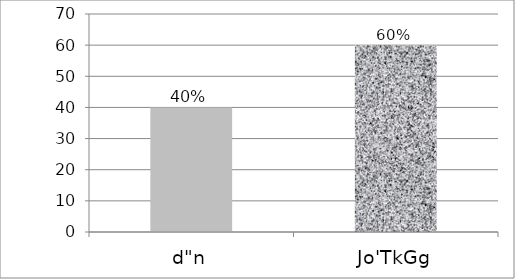
| Category | Series 0 |
|---|---|
| d"n | 40 |
| Jo'TkGg | 60 |